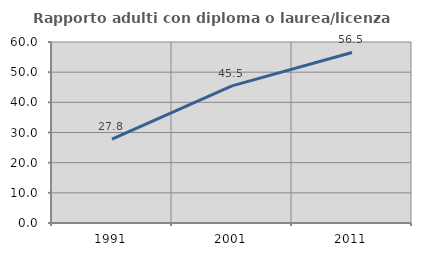
| Category | Rapporto adulti con diploma o laurea/licenza media  |
|---|---|
| 1991.0 | 27.778 |
| 2001.0 | 45.455 |
| 2011.0 | 56.522 |